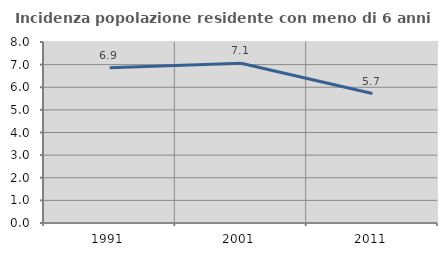
| Category | Incidenza popolazione residente con meno di 6 anni |
|---|---|
| 1991.0 | 6.863 |
| 2001.0 | 7.062 |
| 2011.0 | 5.72 |